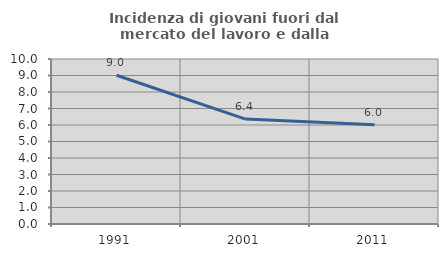
| Category | Incidenza di giovani fuori dal mercato del lavoro e dalla formazione  |
|---|---|
| 1991.0 | 9.014 |
| 2001.0 | 6.36 |
| 2011.0 | 6.012 |